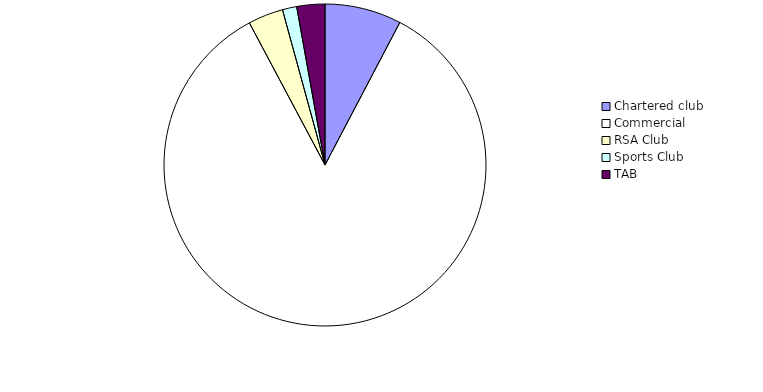
| Category | Series 0 |
|---|---|
| Chartered club | 15860745.54 |
| Commercial | 174160494.98 |
| RSA Club  | 7267618.23 |
| Sports Club | 2958120.96 |
| TAB | 5812767.59 |